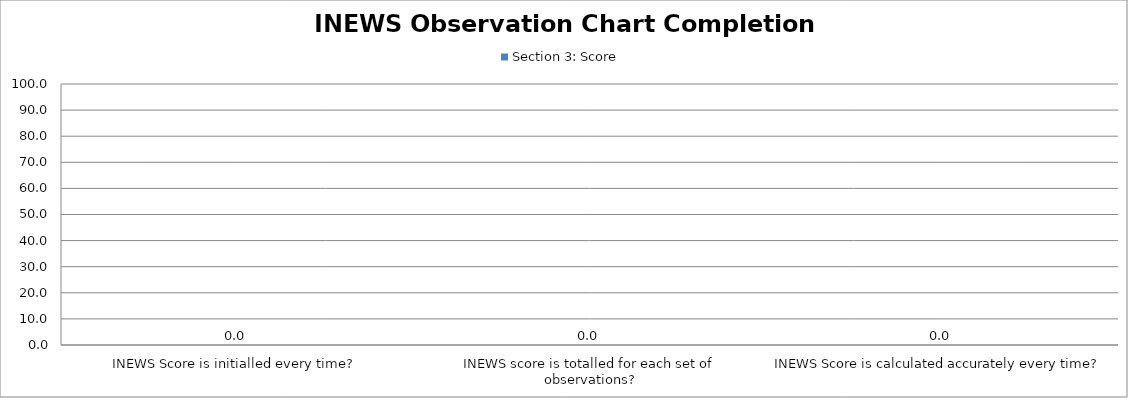
| Category | Section 3: Score |
|---|---|
| INEWS Score is initialled every time? | 0 |
| INEWS score is totalled for each set of observations? | 0 |
| INEWS Score is calculated accurately every time? | 0 |